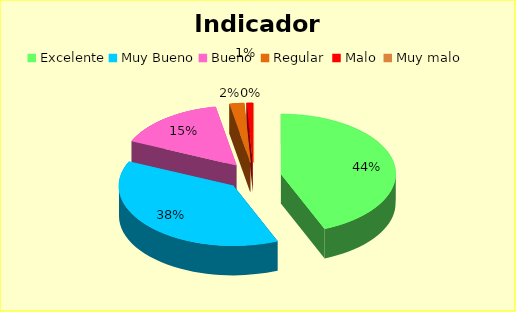
| Category | Series 0 |
|---|---|
| Excelente | 0.438 |
| Muy Bueno | 0.379 |
| Bueno  | 0.154 |
| Regular  | 0.02 |
| Malo  | 0.009 |
| Muy malo  | 0 |